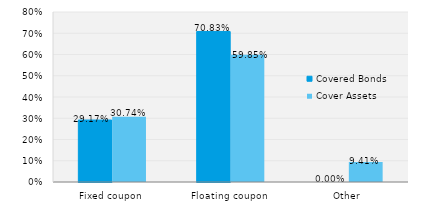
| Category | Covered Bonds | Cover Assets |
|---|---|---|
| Fixed coupon | 0.292 | 0.307 |
| Floating coupon | 0.708 | 0.598 |
| Other | 0 | 0.094 |